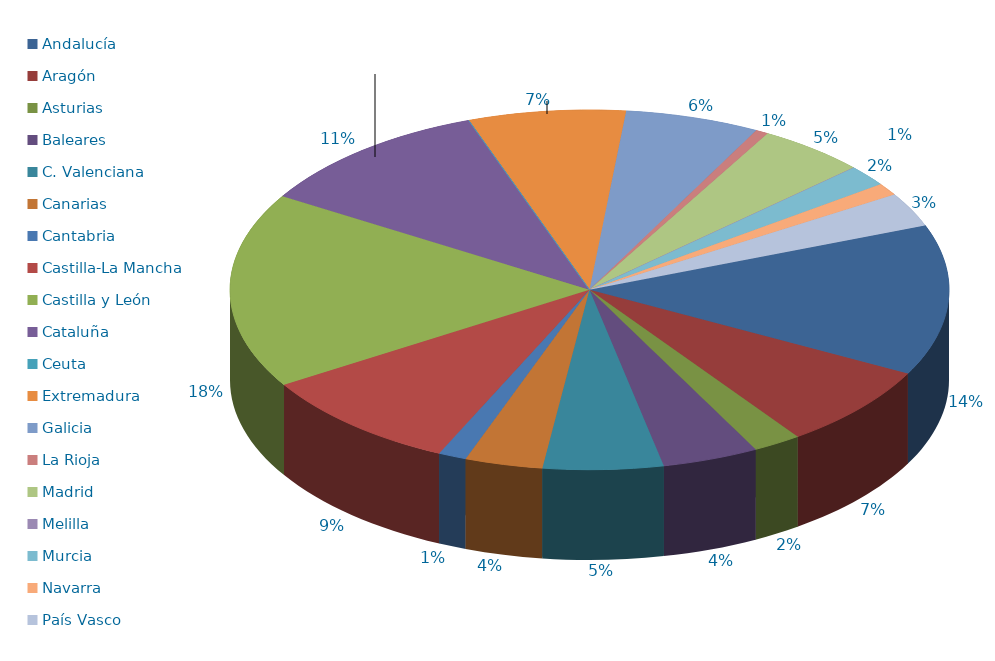
| Category | Series 0 |
|---|---|
| Andalucía | 6032.765 |
| Aragón | 3332.193 |
| Asturias | 971.279 |
| Baleares | 1928.78 |
| C. Valenciana | 2407.645 |
| Canarias | 1560.987 |
| Cantabria | 564.632 |
| Castilla-La Mancha | 4141.118 |
| Castilla y León | 7829.005 |
| Cataluña | 4823.208 |
| Ceuta | 0 |
| Extremadura | 3155.458 |
| Galicia | 2691.51 |
| La Rioja | 257.257 |
| Madrid | 2179.605 |
| Melilla | 0 |
| Murcia | 831.982 |
| Navarra | 494.799 |
| País Vasco | 1360.856 |